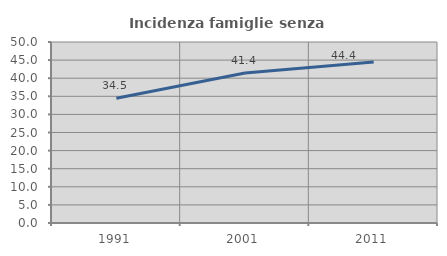
| Category | Incidenza famiglie senza nuclei |
|---|---|
| 1991.0 | 34.466 |
| 2001.0 | 41.414 |
| 2011.0 | 44.444 |